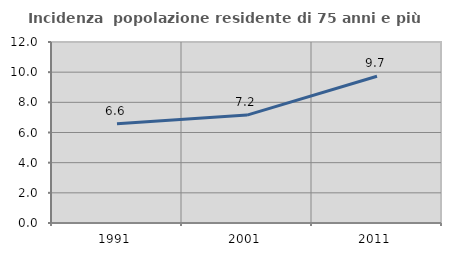
| Category | Incidenza  popolazione residente di 75 anni e più |
|---|---|
| 1991.0 | 6.583 |
| 2001.0 | 7.154 |
| 2011.0 | 9.73 |